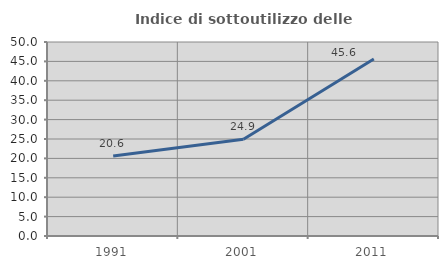
| Category | Indice di sottoutilizzo delle abitazioni  |
|---|---|
| 1991.0 | 20.615 |
| 2001.0 | 24.918 |
| 2011.0 | 45.6 |